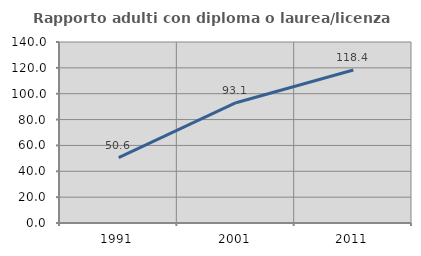
| Category | Rapporto adulti con diploma o laurea/licenza media  |
|---|---|
| 1991.0 | 50.602 |
| 2001.0 | 93.059 |
| 2011.0 | 118.391 |